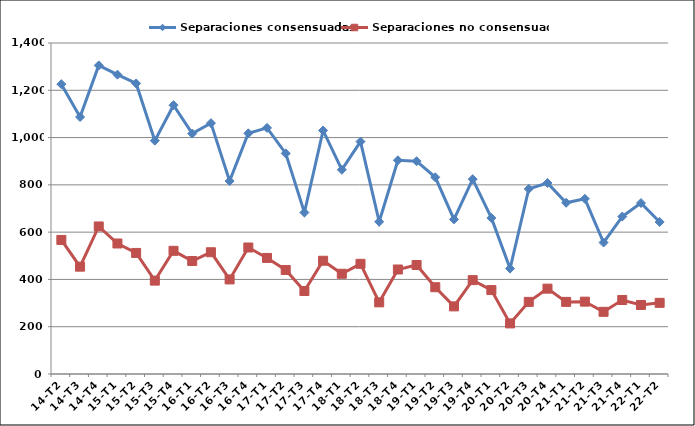
| Category | Separaciones consensuadas | Separaciones no consensuadas |
|---|---|---|
| 14-T2 | 1226 | 567 |
| 14-T3 | 1087 | 454 |
| 14-T4 | 1305 | 624 |
| 15-T1 | 1266 | 552 |
| 15-T2 | 1229 | 512 |
| 15-T3 | 987 | 395 |
| 15-T4 | 1137 | 521 |
| 16-T1 | 1017 | 478 |
| 16-T2 | 1061 | 515 |
| 16-T3 | 816 | 400 |
| 16-T4 | 1018 | 535 |
| 17-T1 | 1041 | 491 |
| 17-T2 | 933 | 440 |
| 17-T3 | 683 | 351 |
| 17-T4 | 1030 | 479 |
| 18-T1 | 864 | 424 |
| 18-T2 | 983 | 466 |
| 18-T3 | 644 | 303 |
| 18-T4 | 904 | 442 |
| 19-T1 | 900 | 461 |
| 19-T2 | 832 | 367 |
| 19-T3 | 654 | 286 |
| 19-T4 | 824 | 397 |
| 20-T1 | 660 | 355 |
| 20-T2 | 446 | 214 |
| 20-T3 | 783 | 305 |
| 20-T4 | 808 | 361 |
| 21-T1 | 724 | 305 |
| 21-T2 | 741 | 306 |
| 21-T3 | 556 | 263 |
| 21-T4 | 666 | 313 |
| 22-T1 | 723 | 292 |
| 22-T2 | 643 | 301 |